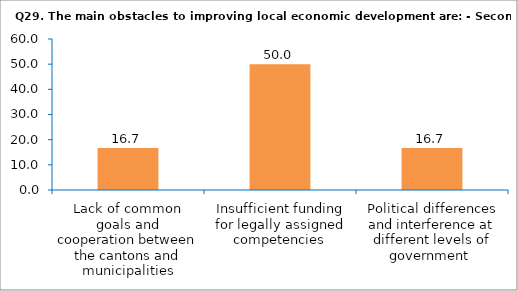
| Category | Series 0 |
|---|---|
| Lack of common goals and cooperation between the cantons and municipalities | 16.667 |
| Insufficient funding for legally assigned competencies | 50 |
| Political differences and interference at different levels of government  | 16.667 |